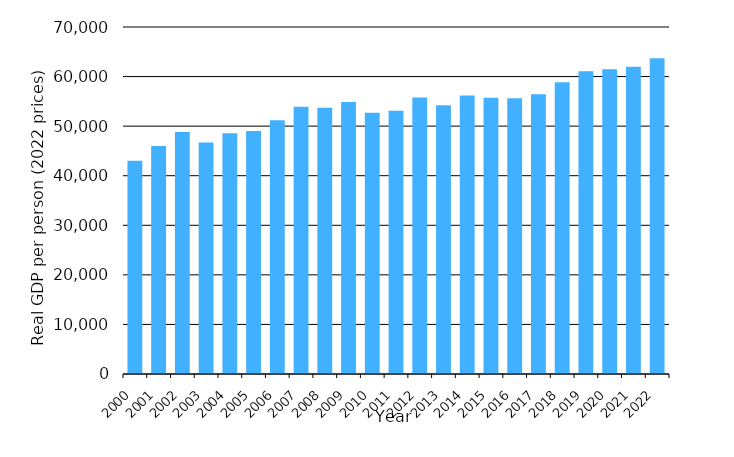
| Category | Real GDP per person (2022 prices) |
|---|---|
| 2000.0 | 43018.444 |
| 2001.0 | 45978.851 |
| 2002.0 | 48820.831 |
| 2003.0 | 46712.424 |
| 2004.0 | 48551.447 |
| 2005.0 | 49025.166 |
| 2006.0 | 51167.983 |
| 2007.0 | 53898.491 |
| 2008.0 | 53691.33 |
| 2009.0 | 54867.957 |
| 2010.0 | 52704.719 |
| 2011.0 | 53083.985 |
| 2012.0 | 55761.42 |
| 2013.0 | 54194.784 |
| 2014.0 | 56190.262 |
| 2015.0 | 55729.48 |
| 2016.0 | 55629.322 |
| 2017.0 | 56456.285 |
| 2018.0 | 58850.097 |
| 2019.0 | 61059.798 |
| 2020.0 | 61498.007 |
| 2021.0 | 61967.945 |
| 2022.0 | 63713 |